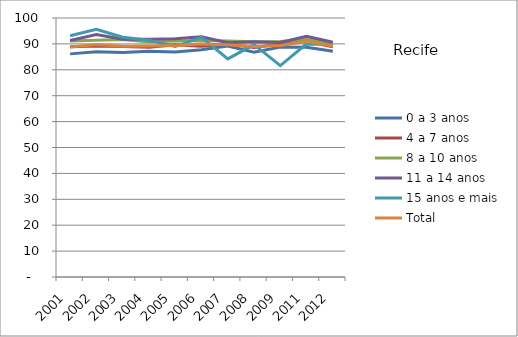
| Category | 0 a 3 anos | 4 a 7 anos | 8 a 10 anos | 11 a 14 anos | 15 anos e mais | Total |
|---|---|---|---|---|---|---|
| 2001.0 | 86.15 | 88.89 | 91.09 | 91.33 | 93.12 | 88.77 |
| 2002.0 | 86.94 | 89.18 | 91.39 | 93.65 | 95.67 | 89.79 |
| 2003.0 | 86.64 | 88.95 | 91.67 | 91.77 | 92.6 | 89.12 |
| 2004.0 | 87.19 | 88.73 | 90.77 | 91.84 | 91.44 | 89.22 |
| 2005.0 | 86.91 | 89.69 | 91.11 | 91.96 | 88.98 | 89.4 |
| 2006.0 | 87.78 | 89.05 | 91.3 | 92.79 | 92.55 | 90 |
| 2007.0 | 89.21 | 89.97 | 91.16 | 90.42 | 84.22 | 89.69 |
| 2008.0 | 86.76 | 88.62 | 90.86 | 90.85 | 89.73 | 88.98 |
| 2009.0 | 88.82 | 89.93 | 90.96 | 90.54 | 81.63 | 89.35 |
| 2011.0 | 88.74 | 90.94 | 91.66 | 92.98 | 90.04 | 90.93 |
| 2012.0 | 87.14 | 88.85 | 90.41 | 90.63 | 89.81 | 89.19 |